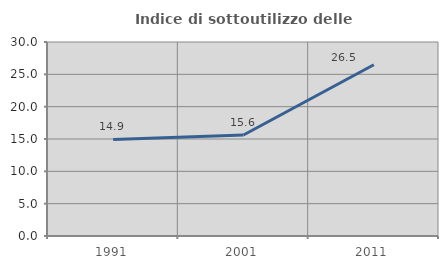
| Category | Indice di sottoutilizzo delle abitazioni  |
|---|---|
| 1991.0 | 14.938 |
| 2001.0 | 15.613 |
| 2011.0 | 26.476 |